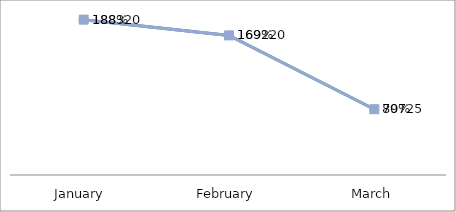
| Category | PROFIT | PERCENTAGE |
|---|---|---|
| January  | 188320 | 1.883 |
| February | 169220 | 1.692 |
| March | 79725 | 0.797 |